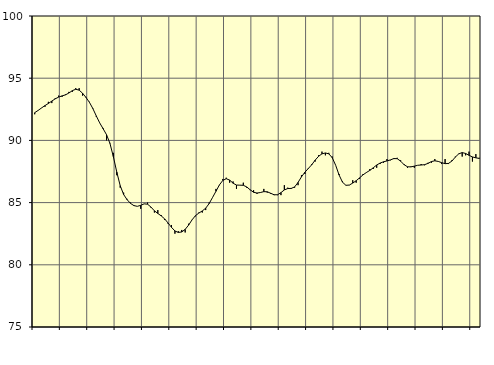
| Category | Piggar | Series 1 |
|---|---|---|
| nan | 92.1 | 92.23 |
| 87.0 | 92.4 | 92.41 |
| 87.0 | 92.6 | 92.61 |
| 87.0 | 92.7 | 92.8 |
| nan | 93.1 | 92.97 |
| 88.0 | 93 | 93.16 |
| 88.0 | 93.4 | 93.34 |
| 88.0 | 93.6 | 93.48 |
| nan | 93.5 | 93.58 |
| 89.0 | 93.7 | 93.66 |
| 89.0 | 93.9 | 93.81 |
| 89.0 | 93.9 | 94 |
| nan | 94.2 | 94.11 |
| 90.0 | 94.2 | 94.04 |
| 90.0 | 93.6 | 93.79 |
| 90.0 | 93.5 | 93.45 |
| nan | 93.1 | 93.06 |
| 91.0 | 92.6 | 92.56 |
| 91.0 | 91.9 | 91.97 |
| 91.0 | 91.4 | 91.41 |
| nan | 91 | 90.94 |
| 92.0 | 90 | 90.46 |
| 92.0 | 89.8 | 89.76 |
| 92.0 | 89 | 88.69 |
| nan | 87.2 | 87.45 |
| 93.0 | 86.2 | 86.36 |
| 93.0 | 85.8 | 85.65 |
| 93.0 | 85.3 | 85.24 |
| nan | 85 | 84.94 |
| 94.0 | 84.8 | 84.76 |
| 94.0 | 84.7 | 84.7 |
| 94.0 | 84.5 | 84.78 |
| nan | 84.9 | 84.9 |
| 95.0 | 85 | 84.87 |
| 95.0 | 84.6 | 84.64 |
| 95.0 | 84.2 | 84.34 |
| nan | 84.4 | 84.13 |
| 96.0 | 84 | 83.93 |
| 96.0 | 83.6 | 83.69 |
| 96.0 | 83.3 | 83.36 |
| nan | 83.2 | 83.01 |
| 97.0 | 82.5 | 82.72 |
| 97.0 | 82.7 | 82.6 |
| 97.0 | 82.8 | 82.64 |
| nan | 82.6 | 82.85 |
| 98.0 | 83.3 | 83.19 |
| 98.0 | 83.6 | 83.61 |
| 98.0 | 83.9 | 83.95 |
| nan | 84.2 | 84.16 |
| 99.0 | 84.2 | 84.33 |
| 99.0 | 84.4 | 84.55 |
| 99.0 | 85 | 84.92 |
| nan | 85.4 | 85.41 |
| 0.0 | 86.1 | 85.91 |
| 0.0 | 86.4 | 86.42 |
| 0.0 | 86.9 | 86.78 |
| nan | 87 | 86.92 |
| 1.0 | 86.6 | 86.81 |
| 1.0 | 86.7 | 86.56 |
| 1.0 | 86.1 | 86.41 |
| nan | 86.4 | 86.4 |
| 2.0 | 86.6 | 86.39 |
| 2.0 | 86.2 | 86.26 |
| 2.0 | 86 | 86.03 |
| nan | 86 | 85.83 |
| 3.0 | 85.7 | 85.77 |
| 3.0 | 85.8 | 85.81 |
| 3.0 | 86.1 | 85.88 |
| nan | 85.8 | 85.87 |
| 4.0 | 85.7 | 85.75 |
| 4.0 | 85.6 | 85.63 |
| 4.0 | 85.6 | 85.63 |
| nan | 85.6 | 85.8 |
| 5.0 | 86.4 | 86.02 |
| 5.0 | 86.2 | 86.13 |
| 5.0 | 86.1 | 86.14 |
| nan | 86.2 | 86.26 |
| 6.0 | 86.4 | 86.62 |
| 6.0 | 87.2 | 87.07 |
| 6.0 | 87.3 | 87.44 |
| nan | 87.7 | 87.74 |
| 7.0 | 88.1 | 88.04 |
| 7.0 | 88.3 | 88.41 |
| 7.0 | 88.8 | 88.72 |
| nan | 89.1 | 88.92 |
| 8.0 | 88.8 | 88.99 |
| 8.0 | 89 | 88.92 |
| 8.0 | 88.7 | 88.61 |
| nan | 88 | 88 |
| 9.0 | 87.3 | 87.22 |
| 9.0 | 86.7 | 86.64 |
| 9.0 | 86.4 | 86.39 |
| nan | 86.4 | 86.41 |
| 10.0 | 86.8 | 86.57 |
| 10.0 | 86.6 | 86.76 |
| 10.0 | 86.9 | 86.99 |
| nan | 87.3 | 87.23 |
| 11.0 | 87.4 | 87.42 |
| 11.0 | 87.7 | 87.59 |
| 11.0 | 87.7 | 87.8 |
| nan | 87.8 | 88.02 |
| 12.0 | 88.1 | 88.18 |
| 12.0 | 88.2 | 88.28 |
| 12.0 | 88.5 | 88.35 |
| nan | 88.4 | 88.43 |
| 13.0 | 88.5 | 88.54 |
| 13.0 | 88.6 | 88.53 |
| 13.0 | 88.4 | 88.33 |
| nan | 88.1 | 88.05 |
| 14.0 | 87.8 | 87.88 |
| 14.0 | 87.9 | 87.87 |
| 14.0 | 87.8 | 87.93 |
| nan | 88 | 88 |
| 15.0 | 88.1 | 88.02 |
| 15.0 | 88 | 88.05 |
| 15.0 | 88.2 | 88.15 |
| nan | 88.2 | 88.3 |
| 16.0 | 88.5 | 88.36 |
| 16.0 | 88.3 | 88.31 |
| 16.0 | 88.1 | 88.21 |
| nan | 88.5 | 88.13 |
| 17.0 | 88.1 | 88.15 |
| 17.0 | 88.4 | 88.34 |
| 17.0 | 88.7 | 88.66 |
| nan | 88.9 | 88.92 |
| 18.0 | 88.7 | 89.02 |
| 18.0 | 88.8 | 88.95 |
| 18.0 | 89.1 | 88.8 |
| nan | 88.3 | 88.67 |
| 19.0 | 88.9 | 88.6 |
| 19.0 | 88.6 | 88.55 |